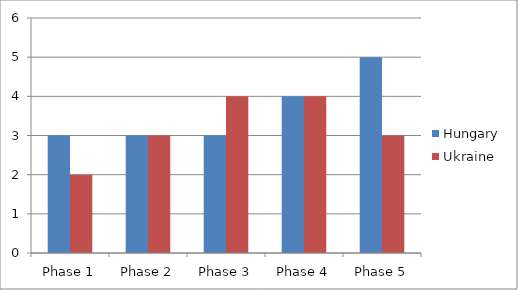
| Category | Hungary | Ukraine |
|---|---|---|
| Phase 1 | 3 | 2 |
| Phase 2 | 3 | 3 |
| Phase 3 | 3 | 4 |
| Phase 4 | 4 | 4 |
| Phase 5 | 5 | 3 |